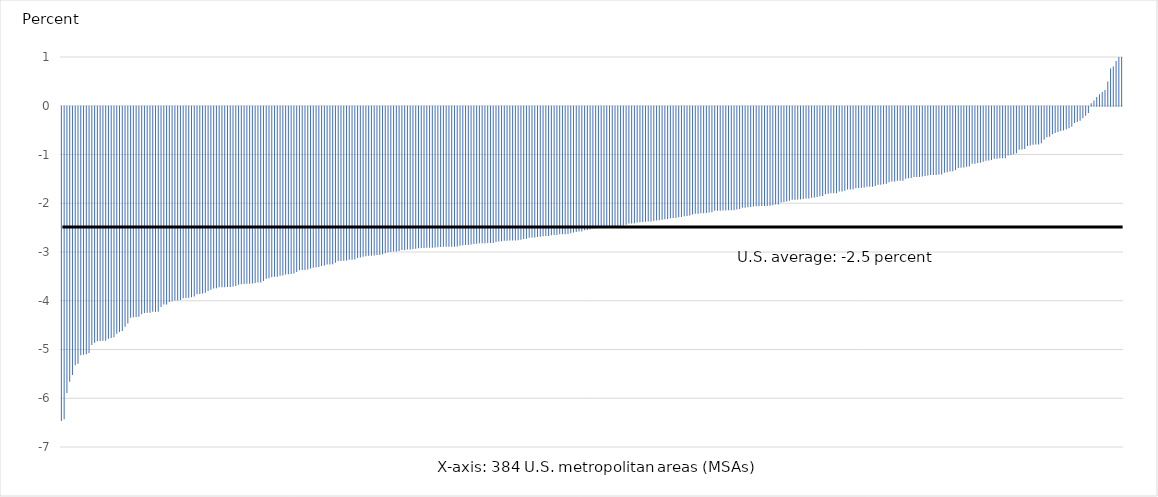
| Category | Series 0 |
|---|---|
| 0 | -6.444 |
| 1 | -6.41 |
| 2 | -5.87 |
| 3 | -5.64 |
| 4 | -5.501 |
| 5 | -5.3 |
| 6 | -5.27 |
| 7 | -5.095 |
| 8 | -5.089 |
| 9 | -5.076 |
| 10 | -5.049 |
| 11 | -4.888 |
| 12 | -4.843 |
| 13 | -4.811 |
| 14 | -4.803 |
| 15 | -4.8 |
| 16 | -4.8 |
| 17 | -4.757 |
| 18 | -4.745 |
| 19 | -4.726 |
| 20 | -4.655 |
| 21 | -4.62 |
| 22 | -4.602 |
| 23 | -4.514 |
| 24 | -4.446 |
| 25 | -4.329 |
| 26 | -4.318 |
| 27 | -4.311 |
| 28 | -4.308 |
| 29 | -4.255 |
| 30 | -4.232 |
| 31 | -4.228 |
| 32 | -4.226 |
| 33 | -4.207 |
| 34 | -4.207 |
| 35 | -4.207 |
| 36 | -4.107 |
| 37 | -4.059 |
| 38 | -4.058 |
| 39 | -4.003 |
| 40 | -3.99 |
| 41 | -3.974 |
| 42 | -3.974 |
| 43 | -3.966 |
| 44 | -3.926 |
| 45 | -3.922 |
| 46 | -3.919 |
| 47 | -3.907 |
| 48 | -3.892 |
| 49 | -3.847 |
| 50 | -3.843 |
| 51 | -3.831 |
| 52 | -3.816 |
| 53 | -3.778 |
| 54 | -3.755 |
| 55 | -3.726 |
| 56 | -3.721 |
| 57 | -3.705 |
| 58 | -3.703 |
| 59 | -3.701 |
| 60 | -3.699 |
| 61 | -3.695 |
| 62 | -3.687 |
| 63 | -3.678 |
| 64 | -3.651 |
| 65 | -3.642 |
| 66 | -3.637 |
| 67 | -3.631 |
| 68 | -3.628 |
| 69 | -3.628 |
| 70 | -3.616 |
| 71 | -3.606 |
| 72 | -3.604 |
| 73 | -3.572 |
| 74 | -3.531 |
| 75 | -3.519 |
| 76 | -3.496 |
| 77 | -3.489 |
| 78 | -3.488 |
| 79 | -3.465 |
| 80 | -3.459 |
| 81 | -3.439 |
| 82 | -3.436 |
| 83 | -3.431 |
| 84 | -3.418 |
| 85 | -3.387 |
| 86 | -3.351 |
| 87 | -3.348 |
| 88 | -3.346 |
| 89 | -3.338 |
| 90 | -3.32 |
| 91 | -3.301 |
| 92 | -3.293 |
| 93 | -3.286 |
| 94 | -3.265 |
| 95 | -3.259 |
| 96 | -3.238 |
| 97 | -3.234 |
| 98 | -3.228 |
| 99 | -3.198 |
| 100 | -3.164 |
| 101 | -3.164 |
| 102 | -3.157 |
| 103 | -3.154 |
| 104 | -3.14 |
| 105 | -3.137 |
| 106 | -3.132 |
| 107 | -3.102 |
| 108 | -3.09 |
| 109 | -3.078 |
| 110 | -3.066 |
| 111 | -3.057 |
| 112 | -3.056 |
| 113 | -3.052 |
| 114 | -3.043 |
| 115 | -3.042 |
| 116 | -3.027 |
| 117 | -3.005 |
| 118 | -2.982 |
| 119 | -2.979 |
| 120 | -2.968 |
| 121 | -2.968 |
| 122 | -2.96 |
| 123 | -2.938 |
| 124 | -2.938 |
| 125 | -2.929 |
| 126 | -2.927 |
| 127 | -2.916 |
| 128 | -2.913 |
| 129 | -2.901 |
| 130 | -2.899 |
| 131 | -2.898 |
| 132 | -2.893 |
| 133 | -2.892 |
| 134 | -2.892 |
| 135 | -2.885 |
| 136 | -2.884 |
| 137 | -2.876 |
| 138 | -2.872 |
| 139 | -2.872 |
| 140 | -2.872 |
| 141 | -2.872 |
| 142 | -2.87 |
| 143 | -2.869 |
| 144 | -2.849 |
| 145 | -2.839 |
| 146 | -2.836 |
| 147 | -2.834 |
| 148 | -2.826 |
| 149 | -2.817 |
| 150 | -2.81 |
| 151 | -2.799 |
| 152 | -2.799 |
| 153 | -2.799 |
| 154 | -2.795 |
| 155 | -2.793 |
| 156 | -2.792 |
| 157 | -2.774 |
| 158 | -2.763 |
| 159 | -2.759 |
| 160 | -2.751 |
| 161 | -2.75 |
| 162 | -2.746 |
| 163 | -2.745 |
| 164 | -2.744 |
| 165 | -2.737 |
| 166 | -2.728 |
| 167 | -2.715 |
| 168 | -2.705 |
| 169 | -2.688 |
| 170 | -2.684 |
| 171 | -2.681 |
| 172 | -2.67 |
| 173 | -2.666 |
| 174 | -2.657 |
| 175 | -2.653 |
| 176 | -2.65 |
| 177 | -2.635 |
| 178 | -2.631 |
| 179 | -2.629 |
| 180 | -2.618 |
| 181 | -2.615 |
| 182 | -2.613 |
| 183 | -2.609 |
| 184 | -2.594 |
| 185 | -2.58 |
| 186 | -2.568 |
| 187 | -2.56 |
| 188 | -2.557 |
| 189 | -2.531 |
| 190 | -2.53 |
| 191 | -2.518 |
| 192 | -2.496 |
| 193 | -2.491 |
| 194 | -2.487 |
| 195 | -2.486 |
| 196 | -2.471 |
| 197 | -2.467 |
| 198 | -2.464 |
| 199 | -2.459 |
| 200 | -2.453 |
| 201 | -2.451 |
| 202 | -2.45 |
| 203 | -2.437 |
| 204 | -2.419 |
| 205 | -2.395 |
| 206 | -2.394 |
| 207 | -2.392 |
| 208 | -2.375 |
| 209 | -2.371 |
| 210 | -2.366 |
| 211 | -2.361 |
| 212 | -2.354 |
| 213 | -2.352 |
| 214 | -2.346 |
| 215 | -2.331 |
| 216 | -2.329 |
| 217 | -2.317 |
| 218 | -2.306 |
| 219 | -2.303 |
| 220 | -2.285 |
| 221 | -2.282 |
| 222 | -2.28 |
| 223 | -2.267 |
| 224 | -2.262 |
| 225 | -2.247 |
| 226 | -2.242 |
| 227 | -2.232 |
| 228 | -2.209 |
| 229 | -2.197 |
| 230 | -2.196 |
| 231 | -2.187 |
| 232 | -2.185 |
| 233 | -2.178 |
| 234 | -2.17 |
| 235 | -2.163 |
| 236 | -2.136 |
| 237 | -2.133 |
| 238 | -2.131 |
| 239 | -2.129 |
| 240 | -2.129 |
| 241 | -2.125 |
| 242 | -2.125 |
| 243 | -2.123 |
| 244 | -2.106 |
| 245 | -2.098 |
| 246 | -2.072 |
| 247 | -2.07 |
| 248 | -2.061 |
| 249 | -2.058 |
| 250 | -2.047 |
| 251 | -2.043 |
| 252 | -2.039 |
| 253 | -2.037 |
| 254 | -2.037 |
| 255 | -2.036 |
| 256 | -2.03 |
| 257 | -2.023 |
| 258 | -2.006 |
| 259 | -2.006 |
| 260 | -1.966 |
| 261 | -1.954 |
| 262 | -1.944 |
| 263 | -1.93 |
| 264 | -1.908 |
| 265 | -1.906 |
| 266 | -1.904 |
| 267 | -1.899 |
| 268 | -1.89 |
| 269 | -1.88 |
| 270 | -1.88 |
| 271 | -1.867 |
| 272 | -1.861 |
| 273 | -1.851 |
| 274 | -1.835 |
| 275 | -1.831 |
| 276 | -1.794 |
| 277 | -1.786 |
| 278 | -1.776 |
| 279 | -1.774 |
| 280 | -1.774 |
| 281 | -1.741 |
| 282 | -1.74 |
| 283 | -1.723 |
| 284 | -1.698 |
| 285 | -1.697 |
| 286 | -1.692 |
| 287 | -1.67 |
| 288 | -1.669 |
| 289 | -1.661 |
| 290 | -1.657 |
| 291 | -1.64 |
| 292 | -1.639 |
| 293 | -1.639 |
| 294 | -1.628 |
| 295 | -1.601 |
| 296 | -1.6 |
| 297 | -1.589 |
| 298 | -1.577 |
| 299 | -1.549 |
| 300 | -1.532 |
| 301 | -1.532 |
| 302 | -1.519 |
| 303 | -1.519 |
| 304 | -1.517 |
| 305 | -1.479 |
| 306 | -1.466 |
| 307 | -1.463 |
| 308 | -1.441 |
| 309 | -1.439 |
| 310 | -1.439 |
| 311 | -1.432 |
| 312 | -1.419 |
| 313 | -1.409 |
| 314 | -1.401 |
| 315 | -1.4 |
| 316 | -1.399 |
| 317 | -1.39 |
| 318 | -1.39 |
| 319 | -1.352 |
| 320 | -1.343 |
| 321 | -1.33 |
| 322 | -1.321 |
| 323 | -1.298 |
| 324 | -1.254 |
| 325 | -1.25 |
| 326 | -1.245 |
| 327 | -1.232 |
| 328 | -1.227 |
| 329 | -1.171 |
| 330 | -1.17 |
| 331 | -1.154 |
| 332 | -1.148 |
| 333 | -1.127 |
| 334 | -1.106 |
| 335 | -1.102 |
| 336 | -1.093 |
| 337 | -1.067 |
| 338 | -1.065 |
| 339 | -1.058 |
| 340 | -1.055 |
| 341 | -1.054 |
| 342 | -1.003 |
| 343 | -0.992 |
| 344 | -0.975 |
| 345 | -0.953 |
| 346 | -0.884 |
| 347 | -0.879 |
| 348 | -0.868 |
| 349 | -0.805 |
| 350 | -0.794 |
| 351 | -0.781 |
| 352 | -0.775 |
| 353 | -0.775 |
| 354 | -0.75 |
| 355 | -0.675 |
| 356 | -0.624 |
| 357 | -0.615 |
| 358 | -0.564 |
| 359 | -0.541 |
| 360 | -0.518 |
| 361 | -0.497 |
| 362 | -0.485 |
| 363 | -0.463 |
| 364 | -0.443 |
| 365 | -0.409 |
| 366 | -0.334 |
| 367 | -0.315 |
| 368 | -0.287 |
| 369 | -0.236 |
| 370 | -0.184 |
| 371 | -0.13 |
| 372 | 0.052 |
| 373 | 0.108 |
| 374 | 0.181 |
| 375 | 0.237 |
| 376 | 0.28 |
| 377 | 0.321 |
| 378 | 0.495 |
| 379 | 0.766 |
| 380 | 0.806 |
| 381 | 0.917 |
| 382 | 1.482 |
| 383 | 1.681 |